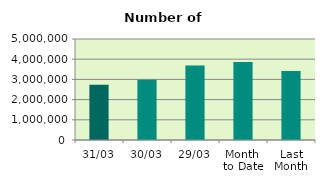
| Category | Series 0 |
|---|---|
| 31/03 | 2733486 |
| 30/03 | 2983722 |
| 29/03 | 3683122 |
| Month 
to Date | 3862771.739 |
| Last
Month | 3413232.3 |